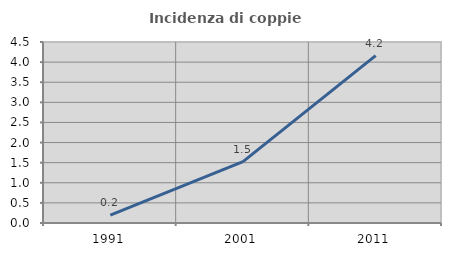
| Category | Incidenza di coppie miste |
|---|---|
| 1991.0 | 0.196 |
| 2001.0 | 1.524 |
| 2011.0 | 4.162 |